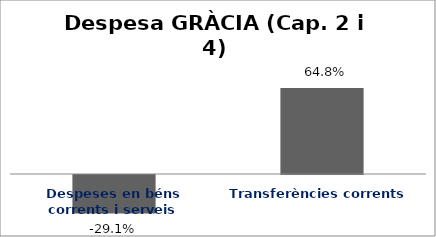
| Category | Series 0 |
|---|---|
| Despeses en béns corrents i serveis | -0.291 |
| Transferències corrents | 0.648 |